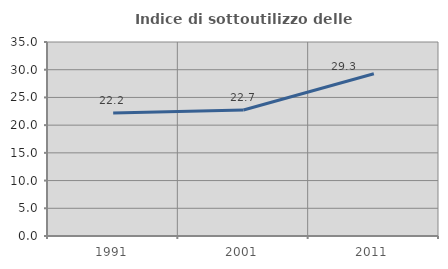
| Category | Indice di sottoutilizzo delle abitazioni  |
|---|---|
| 1991.0 | 22.174 |
| 2001.0 | 22.734 |
| 2011.0 | 29.265 |